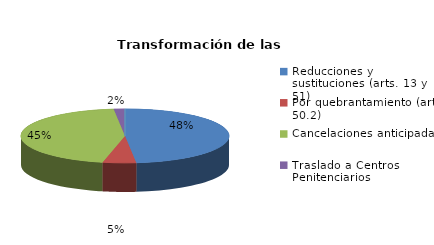
| Category | Series 0 |
|---|---|
| Reducciones y sustituciones (arts. 13 y 51) | 28 |
| Por quebrantamiento (art. 50.2) | 3 |
| Cancelaciones anticipadas | 26 |
| Traslado a Centros Penitenciarios | 1 |
| Conversión internamientos en cerrados (art. 51.2) | 0 |